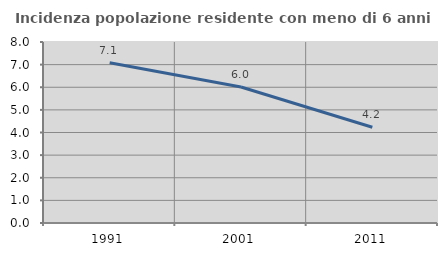
| Category | Incidenza popolazione residente con meno di 6 anni |
|---|---|
| 1991.0 | 7.083 |
| 2001.0 | 6.011 |
| 2011.0 | 4.231 |